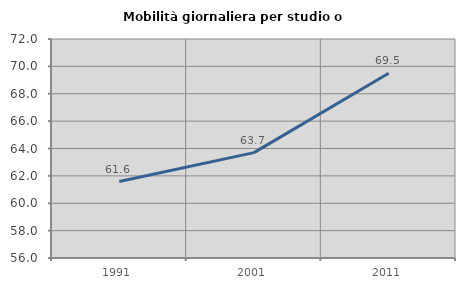
| Category | Mobilità giornaliera per studio o lavoro |
|---|---|
| 1991.0 | 61.583 |
| 2001.0 | 63.697 |
| 2011.0 | 69.504 |